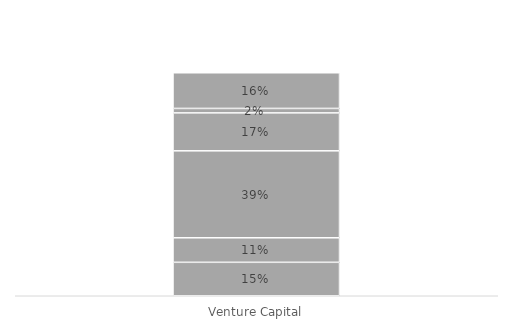
| Category | Proptech | Finanzierung | Insurtech | Investment | Blockchain | Sonstige |
|---|---|---|---|---|---|---|
| Venture Capital | 0.15 | 0.11 | 0.39 | 0.17 | 0.02 | 0.16 |